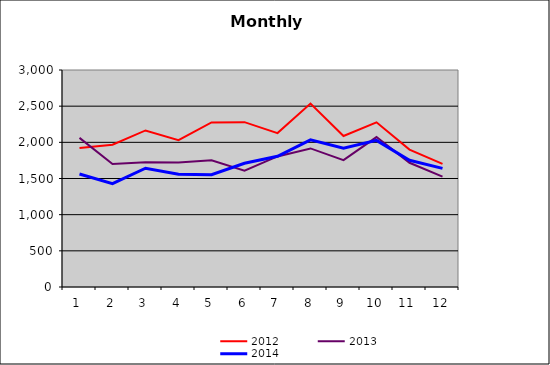
| Category | 2012 | 2013 | 2014 |
|---|---|---|---|
| 0 | 1920.425 | 2061.224 | 1562.786 |
| 1 | 1966.605 | 1701.465 | 1428.045 |
| 2 | 2164.275 | 1724.869 | 1641.75 |
| 3 | 2030.676 | 1722.168 | 1557.532 |
| 4 | 2275.443 | 1750.754 | 1551.352 |
| 5 | 2278.778 | 1609.116 | 1711.075 |
| 6 | 2127.498 | 1804.984 | 1806.747 |
| 7 | 2535.631 | 1915.765 | 2034.885 |
| 8 | 2087.515 | 1753.392 | 1917.793 |
| 9 | 2276.632 | 2072.87 | 2027.253 |
| 10 | 1899.519 | 1717.303 | 1752.347 |
| 11 | 1701.454 | 1525.855 | 1640.395 |